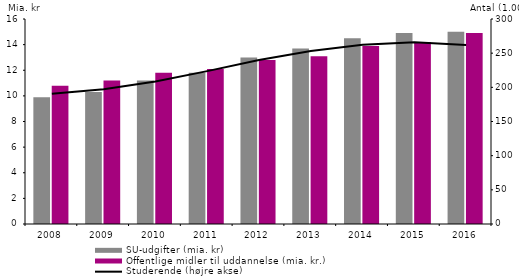
| Category | SU-udgifter (mia. kr) | Offentlige midler til uddannelse (mia. kr.) |
|---|---|---|
| 2008.0 | 9.9 | 10.8 |
| 2009.0 | 10.3 | 11.2 |
| 2010.0 | 11.2 | 11.8 |
| 2011.0 | 11.8 | 12.1 |
| 2012.0 | 13 | 12.8 |
| 2013.0 | 13.7 | 13.1 |
| 2014.0 | 14.5 | 13.9 |
| 2015.0 | 14.9 | 14.2 |
| 2016.0 | 15 | 14.9 |